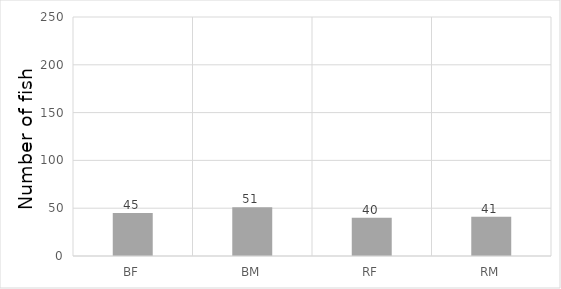
| Category | Count |
|---|---|
| BF | 45 |
| BM | 51 |
| RF | 40 |
| RM | 41 |